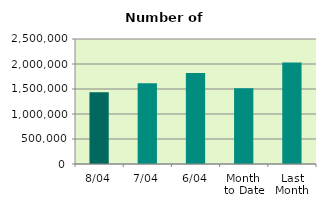
| Category | Series 0 |
|---|---|
| 8/04 | 1434812 |
| 7/04 | 1616532 |
| 6/04 | 1821556 |
| Month 
to Date | 1513907 |
| Last
Month | 2030137.913 |